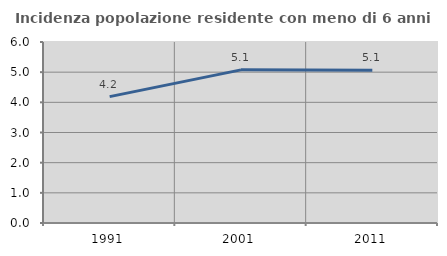
| Category | Incidenza popolazione residente con meno di 6 anni |
|---|---|
| 1991.0 | 4.189 |
| 2001.0 | 5.076 |
| 2011.0 | 5.062 |